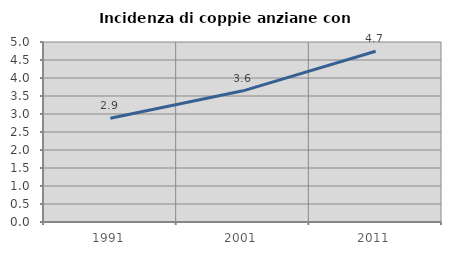
| Category | Incidenza di coppie anziane con figli |
|---|---|
| 1991.0 | 2.881 |
| 2001.0 | 3.644 |
| 2011.0 | 4.743 |